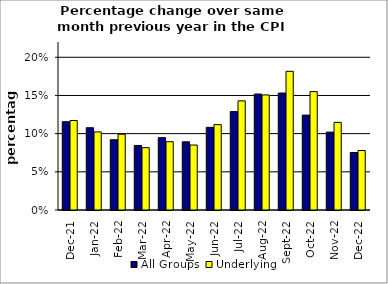
| Category | All Groups | Underlying |
|---|---|---|
| 2021-12-01 | 0.116 | 0.117 |
| 2022-01-01 | 0.108 | 0.102 |
| 2022-02-01 | 0.092 | 0.099 |
| 2022-03-01 | 0.085 | 0.082 |
| 2022-04-01 | 0.095 | 0.089 |
| 2022-05-01 | 0.089 | 0.085 |
| 2022-06-01 | 0.108 | 0.112 |
| 2022-07-01 | 0.129 | 0.143 |
| 2022-08-01 | 0.152 | 0.151 |
| 2022-09-01 | 0.153 | 0.182 |
| 2022-10-01 | 0.124 | 0.155 |
| 2022-11-01 | 0.102 | 0.115 |
| 2022-12-01 | 0.075 | 0.078 |